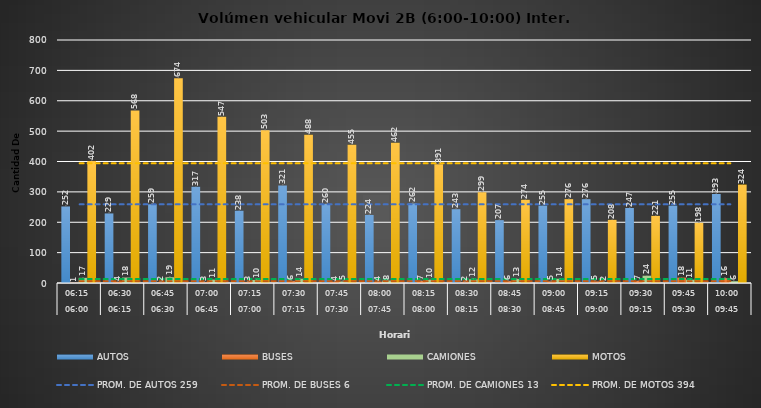
| Category | AUTOS | BUSES | CAMIONES | MOTOS |
|---|---|---|---|---|
| 0 | 252 | 1 | 17 | 402 |
| 1 | 229 | 4 | 18 | 568 |
| 2 | 259 | 2 | 19 | 674 |
| 3 | 317 | 3 | 11 | 547 |
| 4 | 238 | 3 | 10 | 503 |
| 5 | 321 | 6 | 14 | 488 |
| 6 | 260 | 4 | 5 | 455 |
| 7 | 224 | 4 | 8 | 462 |
| 8 | 262 | 7 | 10 | 391 |
| 9 | 243 | 2 | 12 | 299 |
| 10 | 207 | 6 | 13 | 274 |
| 11 | 255 | 5 | 14 | 276 |
| 12 | 276 | 5 | 2 | 208 |
| 13 | 247 | 7 | 24 | 221 |
| 14 | 255 | 18 | 11 | 198 |
| 15 | 293 | 16 | 6 | 324 |